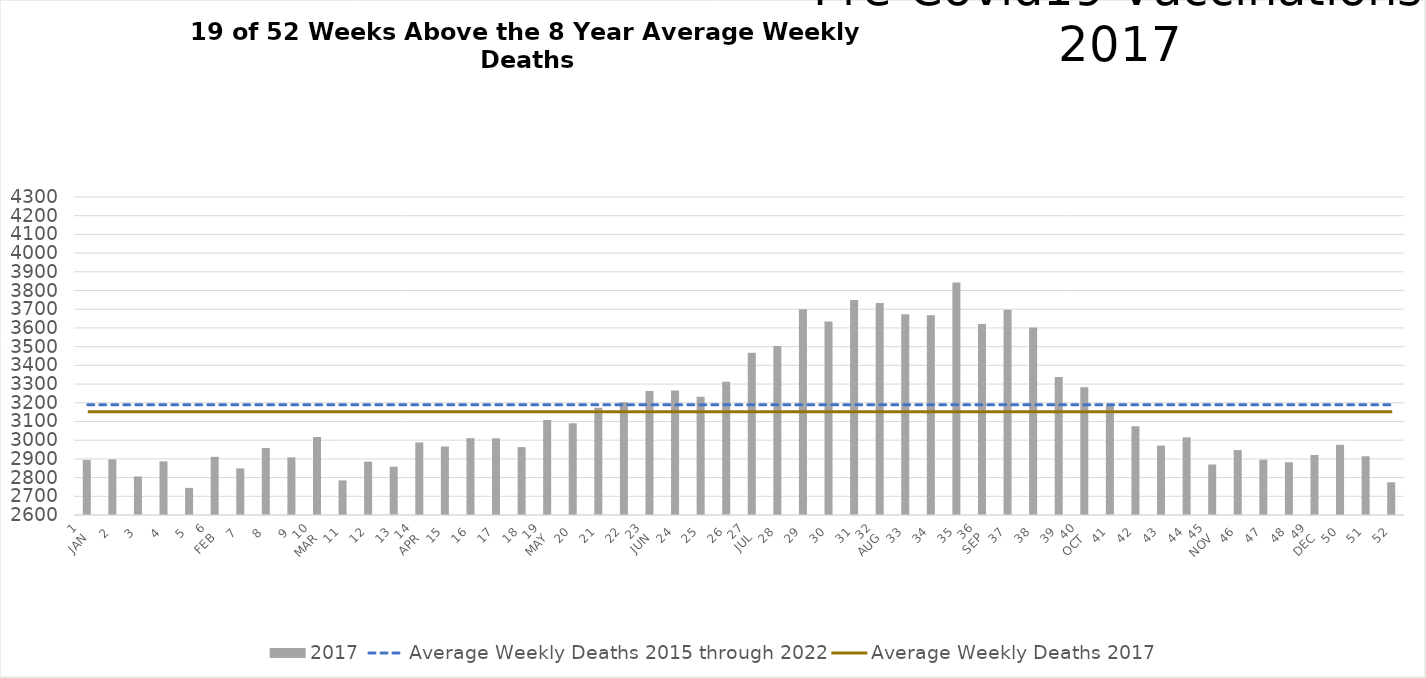
| Category | 2017 |
|---|---|
| 1
JAN | 2895 |
| 2 | 2897 |
| 3 | 2806 |
| 4 | 2887 |
| 5 | 2745 |
| 6
FEB | 2911 |
| 7 | 2849 |
| 8 | 2958 |
| 9 | 2908 |
| 10
MAR | 3017 |
| 11 | 2785 |
| 12 | 2885 |
| 13 | 2858 |
| 14
APR | 2988 |
| 15 | 2966 |
| 16 | 3011 |
| 17 | 3010 |
| 18 | 2963 |
| 19
MAY | 3108 |
| 20 | 3091 |
| 21 | 3173 |
| 22 | 3203 |
| 23
JUN | 3263 |
| 24 | 3266 |
| 25 | 3232 |
| 26 | 3313 |
| 27
JUL | 3468 |
| 28 | 3504 |
| 29 | 3700 |
| 30 | 3634 |
| 31 | 3749 |
| 32
AUG | 3734 |
| 33 | 3673 |
| 34 | 3668 |
| 35 | 3843 |
| 36
SEP | 3621 |
| 37 | 3697 |
| 38 | 3603 |
| 39 | 3338 |
| 40
OCT | 3283 |
| 41 | 3184 |
| 42 | 3075 |
| 43 | 2971 |
| 44 | 3015 |
| 45
NOV | 2870 |
| 46 | 2947 |
| 47 | 2896 |
| 48 | 2882 |
| 49
DEC | 2921 |
| 50 | 2975 |
| 51 | 2914 |
| 52 | 2775 |